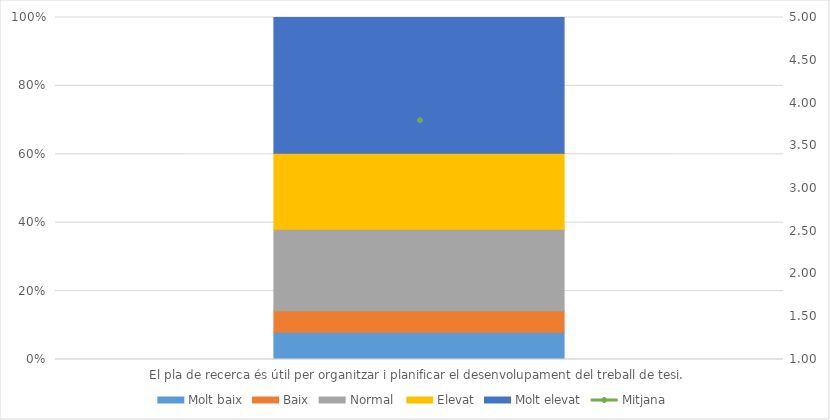
| Category | Molt baix | Baix | Normal  | Elevat | Molt elevat |
|---|---|---|---|---|---|
| El pla de recerca és útil per organitzar i planificar el desenvolupament del treball de tesi. | 5 | 4 | 15 | 14 | 25 |